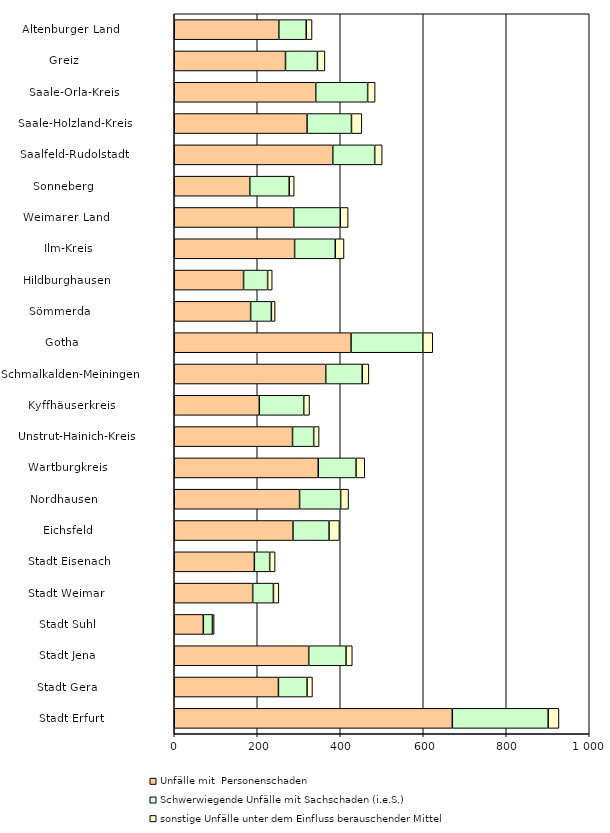
| Category |    Unfälle mit  Personenschaden |    Schwerwiegende Unfälle mit Sachschaden (i.e.S.) |    sonstige Unfälle unter dem Einfluss berauschender Mittel |
|---|---|---|---|
| Stadt Erfurt                   | 670 | 231 | 26 |
| Stadt Gera                     | 251 | 69 | 13 |
| Stadt Jena                     | 324 | 90 | 15 |
| Stadt Suhl                     | 70 | 22 | 4 |
| Stadt Weimar                   | 189 | 50 | 13 |
| Stadt Eisenach                 | 193 | 37 | 13 |
| Eichsfeld                      | 286 | 87 | 25 |
| Nordhausen                     | 302 | 99 | 19 |
| Wartburgkreis                  | 347 | 91 | 21 |
| Unstrut-Hainich-Kreis          | 285 | 51 | 13 |
| Kyffhäuserkreis                | 205 | 107 | 14 |
| Schmalkalden-Meiningen         | 365 | 88 | 16 |
| Gotha                          | 426 | 173 | 24 |
| Sömmerda                       | 184 | 50 | 9 |
| Hildburghausen                 | 167 | 58 | 11 |
| Ilm-Kreis                      | 290 | 98 | 21 |
| Weimarer Land                  | 288 | 112 | 19 |
| Sonneberg                      | 182 | 95 | 12 |
| Saalfeld-Rudolstadt            | 382 | 101 | 18 |
| Saale-Holzland-Kreis           | 320 | 107 | 25 |
| Saale-Orla-Kreis               | 341 | 125 | 18 |
| Greiz                          | 268 | 77 | 18 |
| Altenburger Land               | 252 | 66 | 14 |